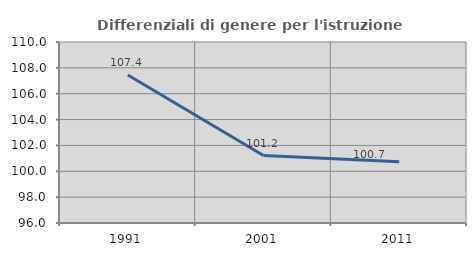
| Category | Differenziali di genere per l'istruzione superiore |
|---|---|
| 1991.0 | 107.448 |
| 2001.0 | 101.219 |
| 2011.0 | 100.736 |